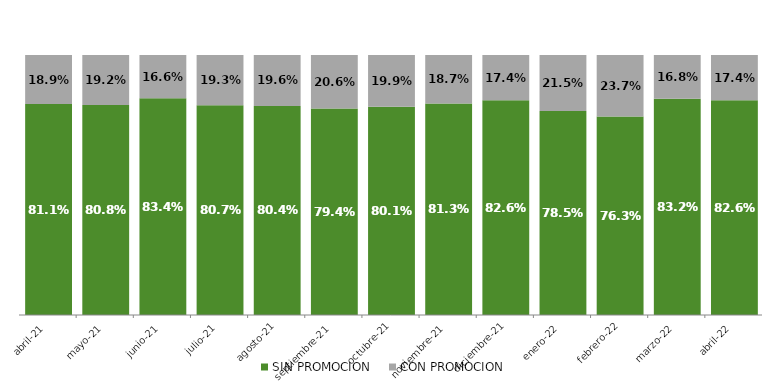
| Category | SIN PROMOCION   | CON PROMOCION   |
|---|---|---|
| 2021-04-01 | 0.811 | 0.189 |
| 2021-05-01 | 0.808 | 0.192 |
| 2021-06-01 | 0.834 | 0.166 |
| 2021-07-01 | 0.807 | 0.193 |
| 2021-08-01 | 0.804 | 0.196 |
| 2021-09-01 | 0.794 | 0.206 |
| 2021-10-01 | 0.801 | 0.199 |
| 2021-11-01 | 0.813 | 0.187 |
| 2021-12-01 | 0.826 | 0.174 |
| 2022-01-01 | 0.785 | 0.215 |
| 2022-02-01 | 0.763 | 0.237 |
| 2022-03-01 | 0.832 | 0.168 |
| 2022-04-01 | 0.826 | 0.174 |